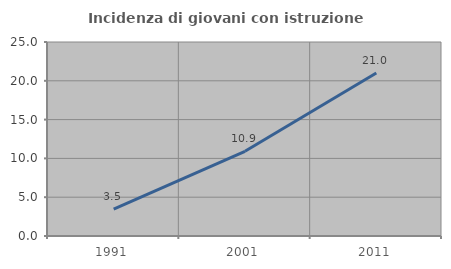
| Category | Incidenza di giovani con istruzione universitaria |
|---|---|
| 1991.0 | 3.468 |
| 2001.0 | 10.92 |
| 2011.0 | 21.008 |